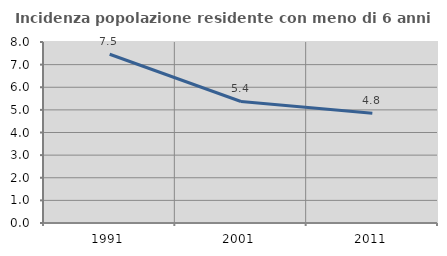
| Category | Incidenza popolazione residente con meno di 6 anni |
|---|---|
| 1991.0 | 7.458 |
| 2001.0 | 5.372 |
| 2011.0 | 4.846 |